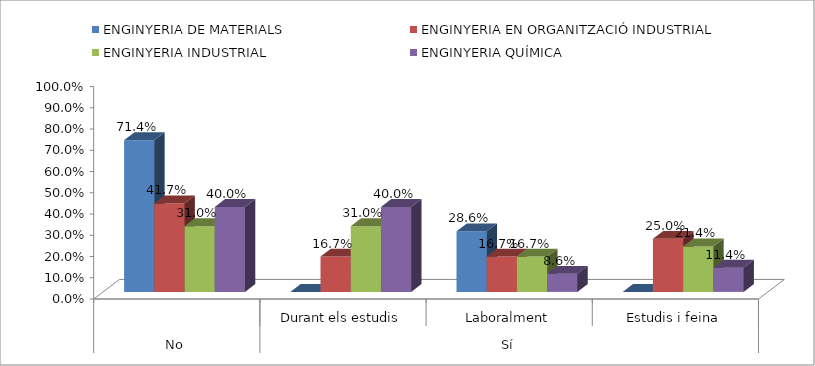
| Category | ENGINYERIA DE MATERIALS | ENGINYERIA EN ORGANITZACIÓ INDUSTRIAL | ENGINYERIA INDUSTRIAL | ENGINYERIA QUÍMICA |
|---|---|---|---|---|
| 0 | 0.714 | 0.417 | 0.31 | 0.4 |
| 1 | 0 | 0.167 | 0.31 | 0.4 |
| 2 | 0.286 | 0.167 | 0.167 | 0.086 |
| 3 | 0 | 0.25 | 0.214 | 0.114 |